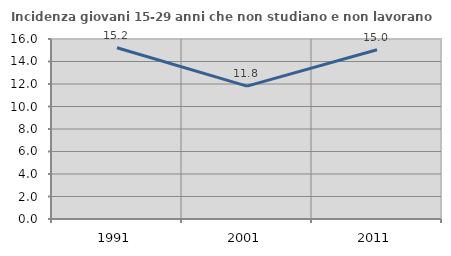
| Category | Incidenza giovani 15-29 anni che non studiano e non lavorano  |
|---|---|
| 1991.0 | 15.217 |
| 2001.0 | 11.811 |
| 2011.0 | 15.044 |